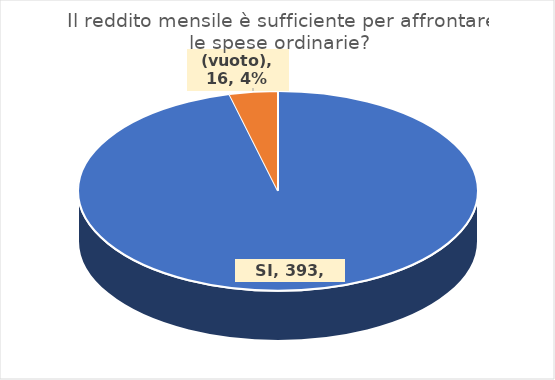
| Category | Series 0 |
|---|---|
| SI | 393 |
| (vuoto) | 16 |